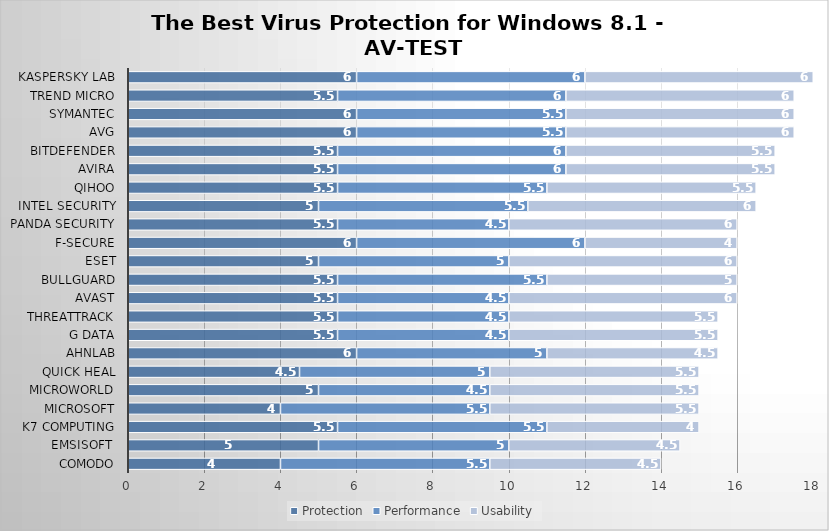
| Category | Protection | Performance | Usability |
|---|---|---|---|
| Comodo | 4 | 5.5 | 4.5 |
| Emsisoft  | 5 | 5 | 4.5 |
| K7 Computing | 5.5 | 5.5 | 4 |
| Microsoft | 4 | 5.5 | 5.5 |
| Microworld | 5 | 4.5 | 5.5 |
| Quick Heal | 4.5 | 5 | 5.5 |
| AhnLab | 6 | 5 | 4.5 |
| G Data | 5.5 | 4.5 | 5.5 |
| ThreatTrack | 5.5 | 4.5 | 5.5 |
| Avast | 5.5 | 4.5 | 6 |
| BullGuard | 5.5 | 5.5 | 5 |
| ESET | 5 | 5 | 6 |
| F-Secure | 6 | 6 | 4 |
| Panda Security | 5.5 | 4.5 | 6 |
| Intel Security | 5 | 5.5 | 6 |
| Qihoo | 5.5 | 5.5 | 5.5 |
| Avira | 5.5 | 6 | 5.5 |
| Bitdefender | 5.5 | 6 | 5.5 |
| AVG | 6 | 5.5 | 6 |
| Symantec | 6 | 5.5 | 6 |
| Trend Micro | 5.5 | 6 | 6 |
| Kaspersky Lab | 6 | 6 | 6 |